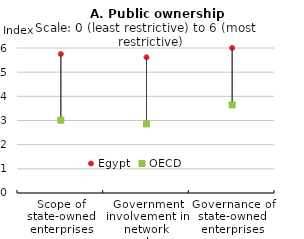
| Category | Egypt | OECD |
|---|---|---|
| Scope of state-owned enterprises | 5.75 | 3.013 |
| Government involvement in network sectors | 5.615 | 2.857 |
| Governance of state-owned enterprises | 6 | 3.646 |